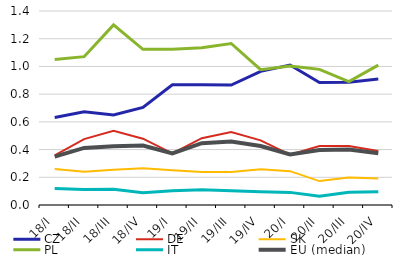
| Category | CZ | DE | SK | PL | IT | EU (median) |
|---|---|---|---|---|---|---|
| 18/I | 0.632 | 0.358 | 0.259 | 1.05 | 0.119 | 0.349 |
| 18/II | 0.674 | 0.475 | 0.24 | 1.071 | 0.111 | 0.412 |
| 18/III | 0.65 | 0.535 | 0.254 | 1.3 | 0.113 | 0.424 |
| 18/IV | 0.704 | 0.478 | 0.265 | 1.124 | 0.089 | 0.429 |
| 19/I | 0.868 | 0.372 | 0.25 | 1.124 | 0.103 | 0.372 |
| 19/II | 0.869 | 0.482 | 0.239 | 1.135 | 0.11 | 0.446 |
| 19/III | 0.866 | 0.527 | 0.238 | 1.166 | 0.103 | 0.458 |
| 19/IV | 0.964 | 0.467 | 0.258 | 0.977 | 0.096 | 0.426 |
| 20/I | 1.01 | 0.363 | 0.244 | 1.002 | 0.091 | 0.364 |
| 20/II | 0.884 | 0.425 | 0.173 | 0.979 | 0.063 | 0.397 |
| 20/III | 0.886 | 0.425 | 0.199 | 0.891 | 0.091 | 0.401 |
| 20/IV | 0.91 | 0.39 | 0.191 | 1.009 | 0.096 | 0.373 |